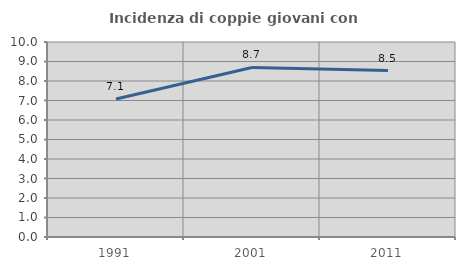
| Category | Incidenza di coppie giovani con figli |
|---|---|
| 1991.0 | 7.08 |
| 2001.0 | 8.696 |
| 2011.0 | 8.537 |